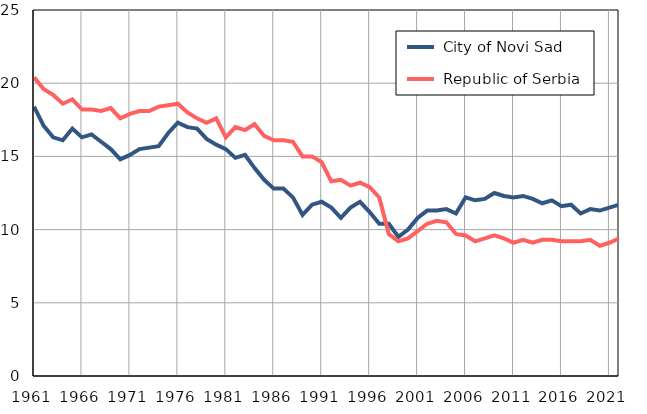
| Category |  City of Novi Sad |  Republic of Serbia |
|---|---|---|
| 1961.0 | 18.4 | 20.4 |
| 1962.0 | 17.1 | 19.6 |
| 1963.0 | 16.3 | 19.2 |
| 1964.0 | 16.1 | 18.6 |
| 1965.0 | 16.9 | 18.9 |
| 1966.0 | 16.3 | 18.2 |
| 1967.0 | 16.5 | 18.2 |
| 1968.0 | 16 | 18.1 |
| 1969.0 | 15.5 | 18.3 |
| 1970.0 | 14.8 | 17.6 |
| 1971.0 | 15.1 | 17.9 |
| 1972.0 | 15.5 | 18.1 |
| 1973.0 | 15.6 | 18.1 |
| 1974.0 | 15.7 | 18.4 |
| 1975.0 | 16.6 | 18.5 |
| 1976.0 | 17.3 | 18.6 |
| 1977.0 | 17 | 18 |
| 1978.0 | 16.9 | 17.6 |
| 1979.0 | 16.2 | 17.3 |
| 1980.0 | 15.8 | 17.6 |
| 1981.0 | 15.5 | 16.3 |
| 1982.0 | 14.9 | 17 |
| 1983.0 | 15.1 | 16.8 |
| 1984.0 | 14.2 | 17.2 |
| 1985.0 | 13.4 | 16.4 |
| 1986.0 | 12.8 | 16.1 |
| 1987.0 | 12.8 | 16.1 |
| 1988.0 | 12.2 | 16 |
| 1989.0 | 11 | 15 |
| 1990.0 | 11.7 | 15 |
| 1991.0 | 11.9 | 14.6 |
| 1992.0 | 11.5 | 13.3 |
| 1993.0 | 10.8 | 13.4 |
| 1994.0 | 11.5 | 13 |
| 1995.0 | 11.9 | 13.2 |
| 1996.0 | 11.2 | 12.9 |
| 1997.0 | 10.4 | 12.2 |
| 1998.0 | 10.4 | 9.7 |
| 1999.0 | 9.5 | 9.2 |
| 2000.0 | 10 | 9.4 |
| 2001.0 | 10.8 | 9.9 |
| 2002.0 | 11.3 | 10.4 |
| 2003.0 | 11.3 | 10.6 |
| 2004.0 | 11.4 | 10.5 |
| 2005.0 | 11.1 | 9.7 |
| 2006.0 | 12.2 | 9.6 |
| 2007.0 | 12 | 9.2 |
| 2008.0 | 12.1 | 9.4 |
| 2009.0 | 12.5 | 9.6 |
| 2010.0 | 12.3 | 9.4 |
| 2011.0 | 12.2 | 9.1 |
| 2012.0 | 12.3 | 9.3 |
| 2013.0 | 12.1 | 9.1 |
| 2014.0 | 11.8 | 9.3 |
| 2015.0 | 12 | 9.3 |
| 2016.0 | 11.6 | 9.2 |
| 2017.0 | 11.7 | 9.2 |
| 2018.0 | 11.1 | 9.2 |
| 2019.0 | 11.4 | 9.3 |
| 2020.0 | 11.3 | 8.9 |
| 2021.0 | 11.5 | 9.1 |
| 2022.0 | 11.7 | 9.4 |